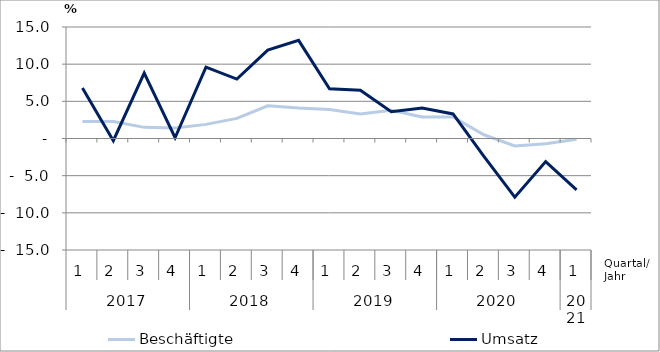
| Category | Beschäftigte | Umsatz |
|---|---|---|
| 0 | 2.3 | 6.8 |
| 1 | 2.3 | -0.3 |
| 2 | 1.5 | 8.8 |
| 3 | 1.4 | 0.1 |
| 4 | 1.9 | 9.6 |
| 5 | 2.7 | 8 |
| 6 | 4.4 | 11.9 |
| 7 | 4.1 | 13.2 |
| 8 | 3.9 | 6.7 |
| 9 | 3.3 | 6.5 |
| 10 | 3.8 | 3.6 |
| 11 | 2.9 | 4.1 |
| 12 | 2.9 | 3.3 |
| 13 | 0.5 | -2.4 |
| 14 | -1 | -7.9 |
| 15 | -0.7 | -3.1 |
| 16 | -0.1 | -6.9 |